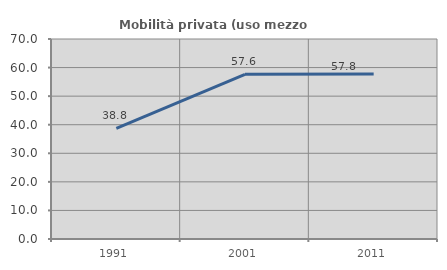
| Category | Mobilità privata (uso mezzo privato) |
|---|---|
| 1991.0 | 38.75 |
| 2001.0 | 57.635 |
| 2011.0 | 57.783 |